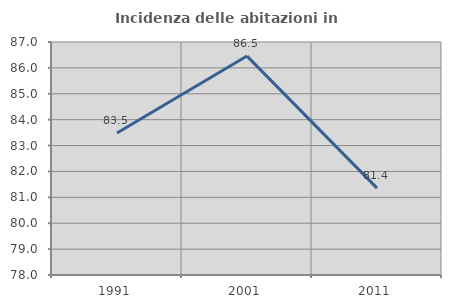
| Category | Incidenza delle abitazioni in proprietà  |
|---|---|
| 1991.0 | 83.485 |
| 2001.0 | 86.456 |
| 2011.0 | 81.355 |